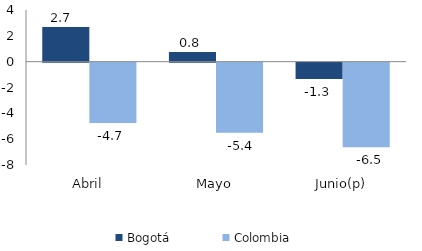
| Category | Bogotá | Colombia |
|---|---|---|
| Abril | 2.674 | -4.671 |
| Mayo | 0.75 | -5.434 |
| Junio(p) | -1.26 | -6.546 |